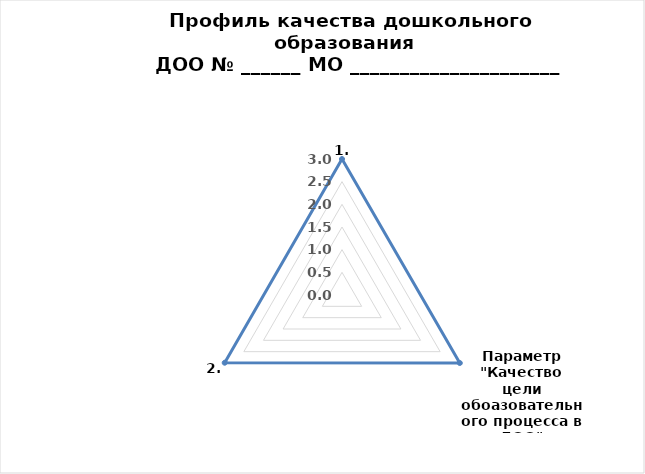
| Category | Оценка  в баллах |
|---|---|
| 0 | 3 |
| 1 | 3 |
| 2 | 2.988 |